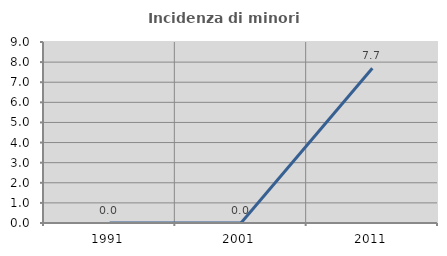
| Category | Incidenza di minori stranieri |
|---|---|
| 1991.0 | 0 |
| 2001.0 | 0 |
| 2011.0 | 7.692 |